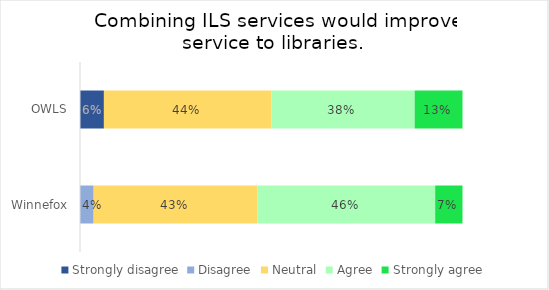
| Category | Strongly disagree | Disagree | Neutral | Agree | Strongly agree |
|---|---|---|---|---|---|
| OWLS | 0.062 | 0 | 0.438 | 0.375 | 0.125 |
| Winnefox | 0 | 0.036 | 0.429 | 0.464 | 0.071 |